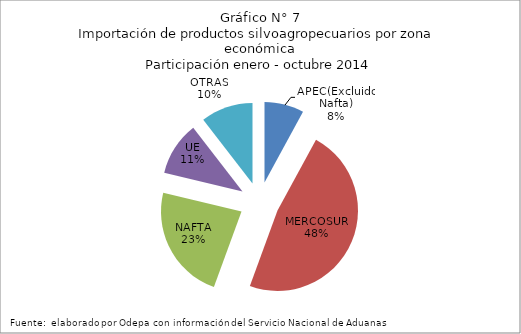
| Category | Series 0 |
|---|---|
| APEC(Excluido Nafta) | 372372.379 |
| MERCOSUR | 2234124.251 |
| NAFTA | 1086656.819 |
| UE | 505272.686 |
| OTRAS | 491718.865 |